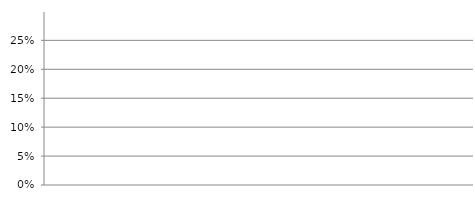
| Category | Selbstfinanzierungsanteil (Selbstfinanzierung / Laufender Ertrag) |
|---|---|
| 2018.0 | 0 |
| 2019.0 | 0 |
| 2020.0 | 0 |
| 2021.0 | 0 |
| 2022.0 | 0 |